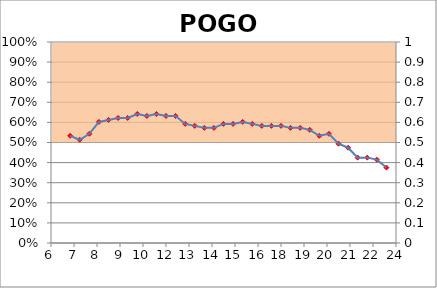
| Category | Series 1 | Series 2 |
|---|---|---|
| 0.25 | 0.5 | 0.5 |
| 0.3125 | 0.5 | 0.5 |
| 0.3333333333333333 | 0.5 | 0.5 |
| 0.3541666666666667 | 0.5 | 0.5 |
| 0.375 | 0.5 | 0.5 |
| 0.3958333333333333 | 0.5 | 0.5 |
| 0.4166666666666667 | 0.5 | 0.5 |
| 0.4375 | 0.5 | 0.5 |
| 0.4583333333333333 | 0.5 | 0.5 |
| 0.4791666666666667 | 0.5 | 0.5 |
| 0.5 | 0.5 | 0.5 |
| 0.5208333333333334 | 0.5 | 0.5 |
| 0.5416666666666666 | 0.5 | 0.5 |
| 0.5625 | 0.5 | 0.5 |
| 0.5833333333333334 | 0.5 | 0.5 |
| 0.6041666666666666 | 0.5 | 0.5 |
| 0.625 | 0.5 | 0.5 |
| 0.6458333333333334 | 0.5 | 0.5 |
| 0.6666666666666666 | 0.5 | 0.5 |
| 0.6875 | 0.5 | 0.5 |
| 0.7083333333333334 | 0.5 | 0.5 |
| 0.7291666666666666 | 0.5 | 0.5 |
| 0.75 | 0.5 | 0.5 |
| 0.7708333333333334 | 0.5 | 0.5 |
| 0.7916666666666666 | 0.5 | 0.5 |
| 0.8125 | 0.5 | 0.5 |
| 0.8333333333333334 | 0.5 | 0.5 |
| 0.8541666666666666 | 0.5 | 0.5 |
| 0.875 | 0.5 | 0.5 |
| 0.8958333333333334 | 0.5 | 0.5 |
| 0.9166666666666666 | 0.5 | 0.5 |
| 0.9375 | 0.5 | 0.5 |
| 0.9583333333333334 | 0.5 | 0.5 |